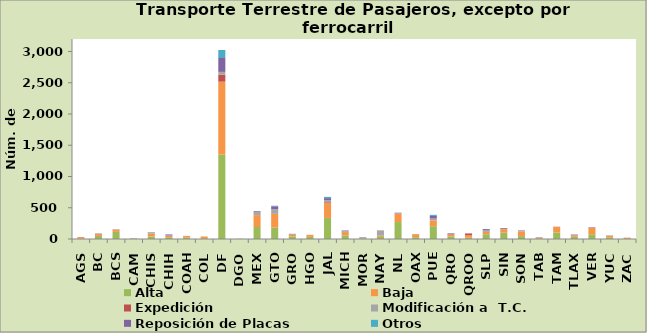
| Category | Alta                                         | Baja | Expedición | Modificación a  T.C. | Reposición de Placas | Otros |
|---|---|---|---|---|---|---|
| AGS | 6 | 25 | 1 | 0 | 0 | 0 |
| BC | 49 | 29 | 6 | 3 | 2 | 0 |
| BCS | 114 | 35 | 1 | 4 | 2 | 0 |
| CAM | 5 | 3 | 0 | 0 | 2 | 1 |
| CHIS | 41 | 48 | 2 | 8 | 4 | 7 |
| CHIH | 29 | 26 | 0 | 2 | 16 | 0 |
| COAH | 23 | 26 | 0 | 0 | 0 | 0 |
| COL | 4 | 36 | 0 | 0 | 0 | 0 |
| DF | 1351 | 1166 | 110 | 47 | 222 | 128 |
| DGO | 1 | 1 | 1 | 0 | 0 | 0 |
| MEX | 192 | 190 | 0 | 44 | 18 | 0 |
| GTO | 181 | 219 | 2 | 74 | 48 | 8 |
| GRO | 40 | 25 | 1 | 18 | 0 | 0 |
| HGO | 34 | 33 | 0 | 0 | 0 | 0 |
| JAL | 337 | 236 | 15 | 34 | 32 | 20 |
| MICH | 58 | 52 | 6 | 10 | 10 | 0 |
| MOR | 10 | 3 | 0 | 13 | 4 | 0 |
| NAY | 33 | 17 | 4 | 85 | 0 | 0 |
| NL | 271 | 132 | 3 | 7 | 8 | 0 |
| OAX | 29 | 46 | 3 | 0 | 0 | 0 |
| PUE | 205 | 94 | 0 | 28 | 42 | 18 |
| QRO | 42 | 30 | 7 | 1 | 10 | 0 |
| QROO | 21 | 43 | 24 | 1 | 2 | 0 |
| SLP | 77 | 35 | 2 | 22 | 22 | 0 |
| SIN | 101 | 57 | 0 | 5 | 12 | 0 |
| SON | 46 | 75 | 1 | 6 | 8 | 1 |
| TAB | 9 | 15 | 1 | 0 | 4 | 0 |
| TAM | 104 | 87 | 4 | 2 | 0 | 0 |
| TLAX | 35 | 25 | 0 | 1 | 10 | 0 |
| VER | 76 | 104 | 2 | 1 | 6 | 0 |
| YUC | 27 | 26 | 0 | 3 | 2 | 0 |
| ZAC | 3 | 19 | 0 | 0 | 0 | 0 |